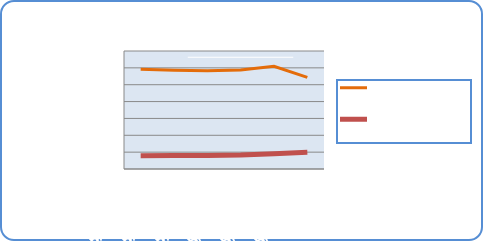
| Category | Motorin Türleri  | Benzin Türleri |
|---|---|---|
| 5/7/18 | 59150009.936 | 7861371.922 |
| 5/8/18 | 58576980.449 | 7935690.483 |
| 5/9/18 | 58354742.19 | 7988623.234 |
| 5/10/18 | 58682476.266 | 8270577.592 |
| 5/11/18 | 60958567.875 | 9099798.895 |
| 5/12/18 | 54334102.108 | 9893492.443 |